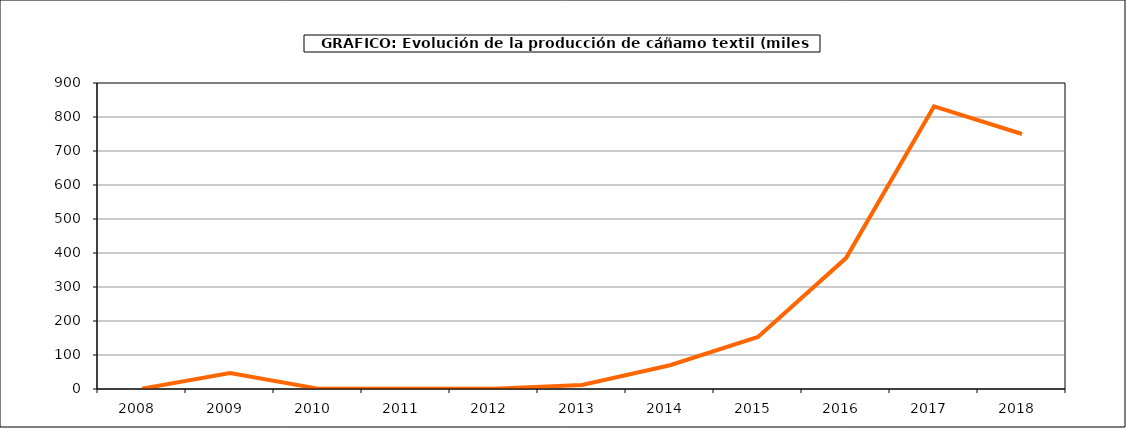
| Category | Producción |
|---|---|
| 2008.0 | 1 |
| 2009.0 | 47 |
| 2010.0 | 1 |
| 2011.0 | 1 |
| 2012.0 | 1 |
| 2013.0 | 12 |
| 2014.0 | 70 |
| 2015.0 | 153 |
| 2016.0 | 385 |
| 2017.0 | 831 |
| 2018.0 | 750 |